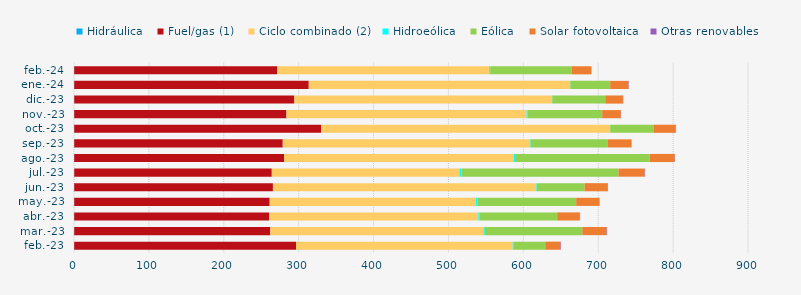
| Category | Hidráulica | Fuel/gas (1) | Ciclo combinado (2) | Hidroeólica | Eólica | Solar fotovoltaica | Otras renovables |
|---|---|---|---|---|---|---|---|
| feb.-23 | 0.254 | 296.212 | 289.333 | 0.829 | 42.671 | 20.383 | 0.711 |
| mar.-23 | 0.282 | 261.841 | 284.831 | 1.572 | 130.237 | 32.429 | 0.738 |
| abr.-23 | 0.276 | 260.1 | 279.544 | 1.573 | 103.686 | 30.034 | 0.631 |
| may.-23 | 0.298 | 261.008 | 275.341 | 2.067 | 131.849 | 30.564 | 0.651 |
| jun.-23 | 0.284 | 265.329 | 351.459 | 0.809 | 63.875 | 30.692 | 0.665 |
| jul.-23 | 0.302 | 263.817 | 250.521 | 2.759 | 209.601 | 35.003 | 0.646 |
| ago.-23 | 0.29 | 280.25 | 306.931 | 2.7 | 178.402 | 33.602 | 0.375 |
| sep.-23 | 0.289 | 278.469 | 329.651 | 1.315 | 103.233 | 31.322 | 0.372 |
| oct.-23 | 0.303 | 329.853 | 385.374 | 0.443 | 57.759 | 29.7 | 0.524 |
| nov.-23 | 0.28 | 283.46 | 320.608 | 1.09 | 99.873 | 24.842 | 0.425 |
| dic.-23 | 0.306 | 293.933 | 343.705 | 0.669 | 70.816 | 23.549 | 0.445 |
| ene.-24 | 0.296 | 313.174 | 348.608 | 0.668 | 53.196 | 24.433 | 0.5 |
| feb.-24 | 0.285 | 271.12 | 282.957 | 1.415 | 108.558 | 26.103 | 0.499 |